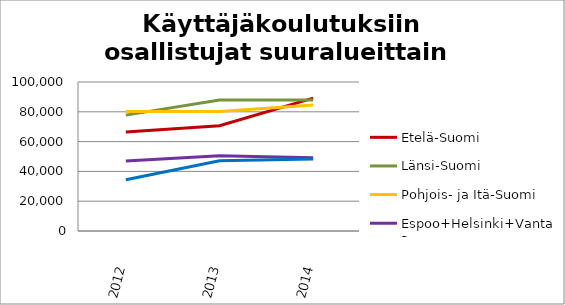
| Category | Etelä-Suomi | Länsi-Suomi | Pohjois- ja Itä-Suomi | Espoo+Helsinki+Vantaa | Muu Uusimaa |
|---|---|---|---|---|---|
| 2012.0 | 66495 | 77772 | 80229 | 46949 | 34434 |
| 2013.0 | 70683 | 87896 | 80127 | 50513 | 47202 |
| 2014.0 | 89153 | 87866 | 84613 | 49119 | 48393 |